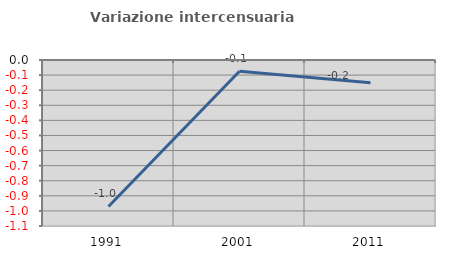
| Category | Variazione intercensuaria annua |
|---|---|
| 1991.0 | -0.971 |
| 2001.0 | -0.074 |
| 2011.0 | -0.15 |